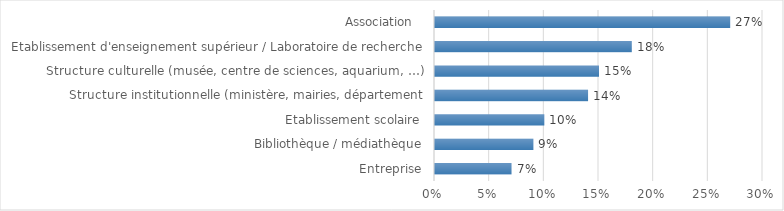
| Category | Entreprise |
|---|---|
| Entreprise | 0.07 |
| Bibliothèque / médiathèque | 0.09 |
| Etablissement scolaire | 0.1 |
| Structure institutionnelle (ministère, mairies, département | 0.14 |
| Structure culturelle (musée, centre de sciences, aquarium, …) | 0.15 |
| Etablissement d'enseignement supérieur / Laboratoire de recherche | 0.18 |
| Association   | 0.27 |